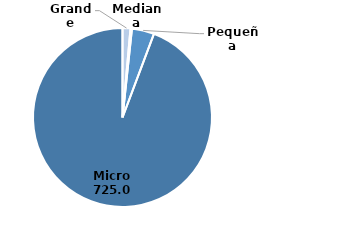
| Category | Número de empresas de sector de bebidas no alcohólicas |
|---|---|
| Grande | 11 |
| Mediana | 2 |
| Pequeña | 31 |
| Micro | 725 |